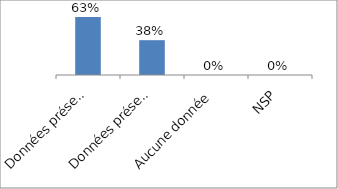
| Category | Series 0 |
|---|---|
| Données présentes pour tous les programmes | 0.625 |
| Données présentes pour quelques programmes | 0.375 |
| Aucune donnée | 0 |
| NSP | 0 |